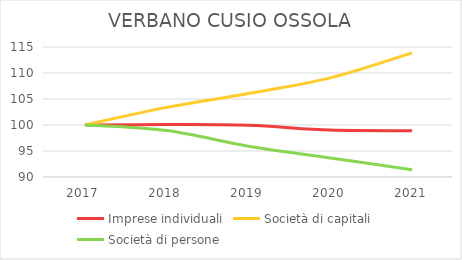
| Category | Imprese individuali | Società di capitali | Società di persone |
|---|---|---|---|
| 2017.0 | 100 | 100 | 100 |
| 2018.0 | 100.08 | 103.39 | 98.923 |
| 2019.0 | 99.94 | 106.066 | 95.916 |
| 2020.0 | 99.02 | 109.054 | 93.671 |
| 2021.0 | 98.9 | 113.872 | 91.382 |